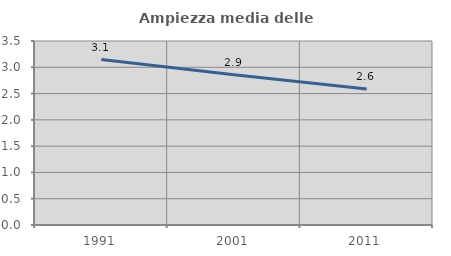
| Category | Ampiezza media delle famiglie |
|---|---|
| 1991.0 | 3.147 |
| 2001.0 | 2.856 |
| 2011.0 | 2.588 |